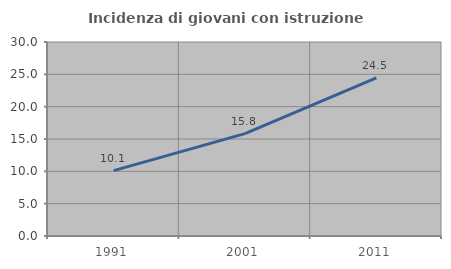
| Category | Incidenza di giovani con istruzione universitaria |
|---|---|
| 1991.0 | 10.104 |
| 2001.0 | 15.824 |
| 2011.0 | 24.453 |